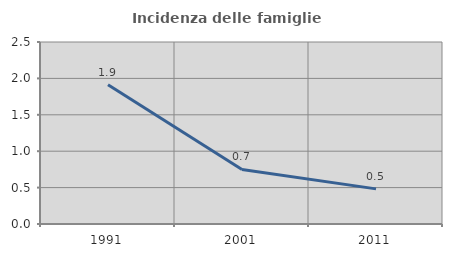
| Category | Incidenza delle famiglie numerose |
|---|---|
| 1991.0 | 1.912 |
| 2001.0 | 0.75 |
| 2011.0 | 0.483 |